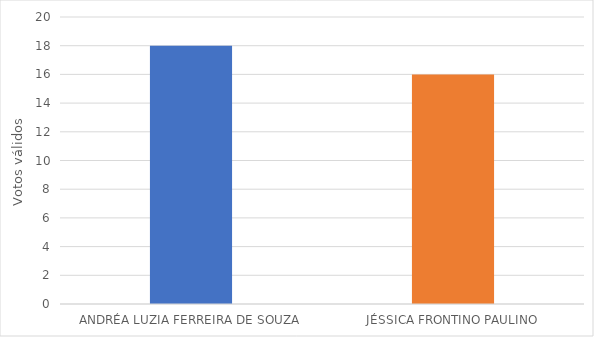
| Category | Series 0 |
|---|---|
| ANDRÉA LUZIA FERREIRA DE SOUZA | 18 |
| JÉSSICA FRONTINO PAULINO | 16 |